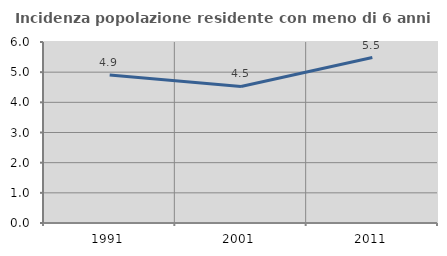
| Category | Incidenza popolazione residente con meno di 6 anni |
|---|---|
| 1991.0 | 4.904 |
| 2001.0 | 4.527 |
| 2011.0 | 5.484 |